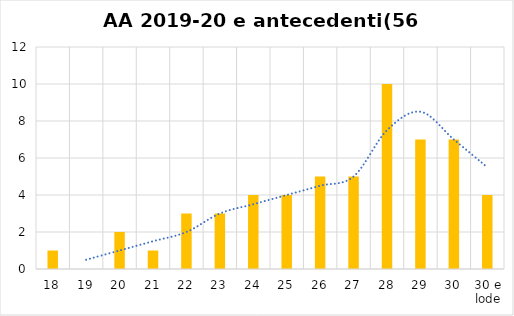
| Category | Series 0 |
|---|---|
| 18 | 1 |
| 19 | 0 |
| 20 | 2 |
| 21 | 1 |
| 22 | 3 |
| 23 | 3 |
| 24 | 4 |
| 25 | 4 |
| 26 | 5 |
| 27 | 5 |
| 28 | 10 |
| 29 | 7 |
| 30 | 7 |
| 30 e lode | 4 |